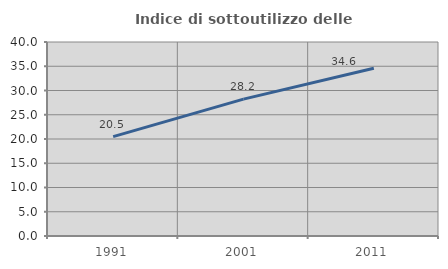
| Category | Indice di sottoutilizzo delle abitazioni  |
|---|---|
| 1991.0 | 20.48 |
| 2001.0 | 28.217 |
| 2011.0 | 34.571 |